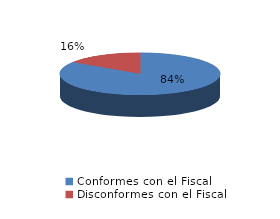
| Category | Series 0 |
|---|---|
| 0 | 125 |
| 1 | 23 |